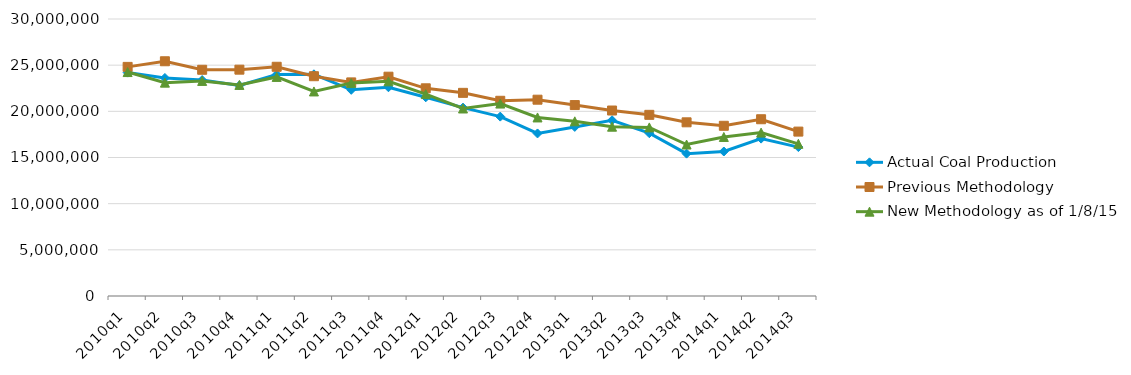
| Category | Actual Coal Production | Previous Methodology | New Methodology as of 1/8/15 |
|---|---|---|---|
| 2010q1 | 24194933 | 24813311 | 24254252 |
| 2010q2 | 23614511 | 25422790 | 23108733 |
| 2010q3 | 23388614 | 24500714 | 23294545 |
| 2010q4 | 22802322 | 24513268 | 22861931 |
| 2011q1 | 23988556 | 24826101 | 23727948 |
| 2011q2 | 24010605 | 23804443 | 22154566 |
| 2011q3 | 22329765 | 23133692 | 23059121 |
| 2011q4 | 22607001 | 23751406 | 23246629 |
| 2012q1 | 21522841 | 22493588 | 21867523 |
| 2012q2 | 20404312 | 22001732 | 20308243 |
| 2012q3 | 19427555 | 21142735 | 20841455 |
| 2012q4 | 17604415 | 21259781 | 19337457 |
| 2013q1 | 18314009 | 20678508 | 18918207 |
| 2013q2 | 19032286 | 20088134 | 18336243 |
| 2013q3 | 17631067 | 19619922 | 18257856 |
| 2013q4 | 15419040 | 18810132 | 16405893 |
| 2014q1 | 15649075 | 18433807 | 17223932 |
| 2014q2 | 17044373 | 19143579 | 17694331 |
| 2014q3 | 16127152 | 17804836 | 16482239 |